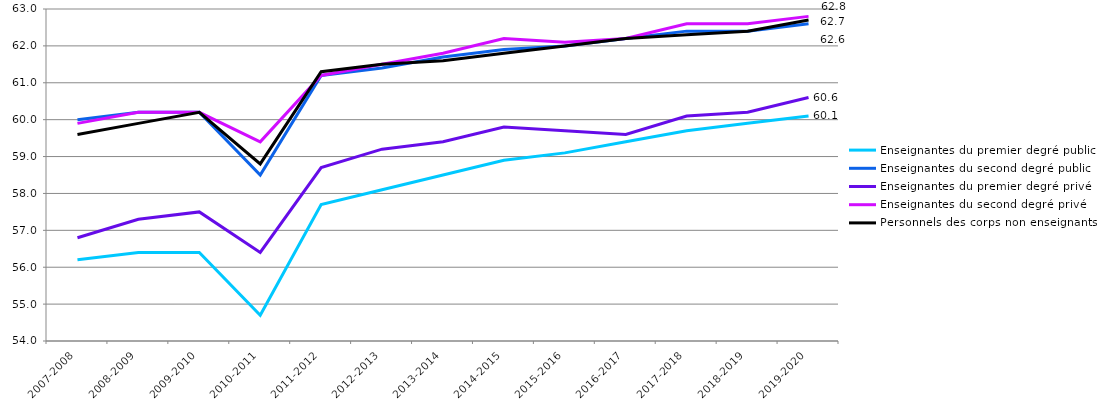
| Category | Enseignantes du premier degré public | Enseignantes du second degré public | Enseignantes du premier degré privé | Enseignantes du second degré privé | Personnels des corps non enseignants  |
|---|---|---|---|---|---|
| 2007-2008 | 56.2 | 60 | 56.8 | 59.9 | 59.6 |
| 2008-2009 | 56.4 | 60.2 | 57.3 | 60.2 | 59.9 |
| 2009-2010 | 56.4 | 60.2 | 57.5 | 60.2 | 60.2 |
| 2010-2011 | 54.7 | 58.5 | 56.4 | 59.4 | 58.8 |
| 2011-2012 | 57.7 | 61.2 | 58.7 | 61.2 | 61.3 |
| 2012-2013 | 58.1 | 61.4 | 59.2 | 61.5 | 61.5 |
| 2013-2014 | 58.5 | 61.7 | 59.4 | 61.8 | 61.6 |
| 2014-2015 | 58.9 | 61.9 | 59.8 | 62.2 | 61.8 |
| 2015-2016 | 59.1 | 62 | 59.7 | 62.1 | 62 |
| 2016-2017 | 59.4 | 62.2 | 59.6 | 62.2 | 62.2 |
| 2017-2018 | 59.7 | 62.4 | 60.1 | 62.6 | 62.3 |
| 2018-2019 | 59.9 | 62.4 | 60.2 | 62.6 | 62.4 |
| 2019-2020 | 60.1 | 62.6 | 60.6 | 62.8 | 62.7 |